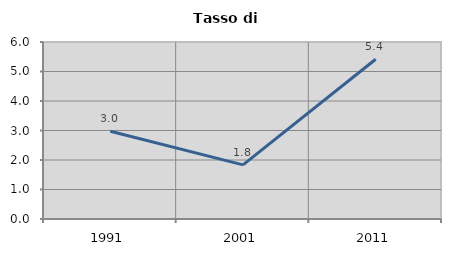
| Category | Tasso di disoccupazione   |
|---|---|
| 1991.0 | 2.975 |
| 2001.0 | 1.836 |
| 2011.0 | 5.415 |